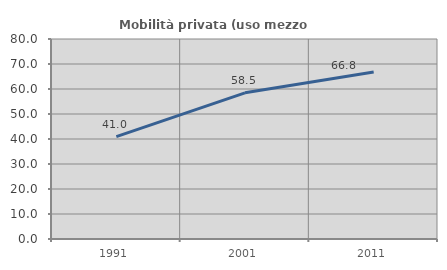
| Category | Mobilità privata (uso mezzo privato) |
|---|---|
| 1991.0 | 40.98 |
| 2001.0 | 58.474 |
| 2011.0 | 66.78 |